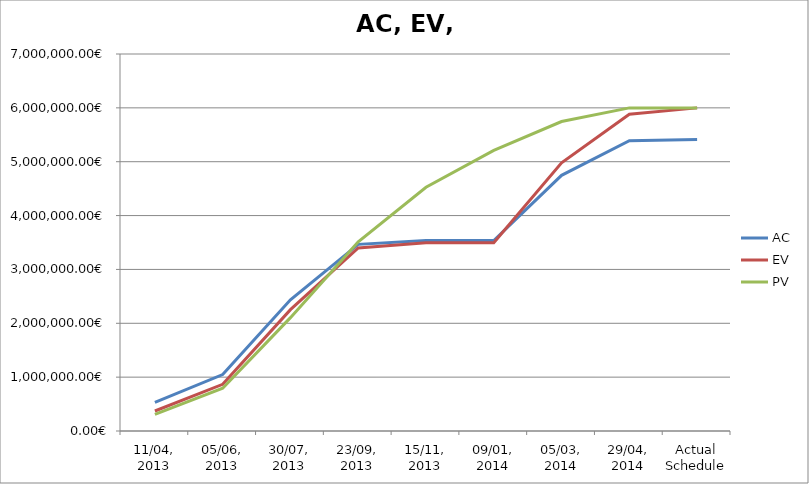
| Category | AC | EV | PV |
|---|---|---|---|
| 11/04, 2013 | 531720 | 371280.002 | 309448 |
| 05/06, 2013 | 1048832 | 866592.002 | 794376 |
| 30/07, 2013 | 2435456 | 2253215.997 | 2104416 |
| 23/09, 2013 | 3465320 | 3398241.293 | 3513608 |
| 15/11, 2013 | 3535832 | 3496392 | 4524912 |
| 09/01, 2014 | 3535832 | 3496392 | 5209720 |
| 05/03, 2014 | 4747840 | 4980792 | 5746416 |
| 29/04, 2014 | 5391120 | 5882480 | 5999600 |
| Actual Schedule | 5414544 | 5999600 | 5999600 |